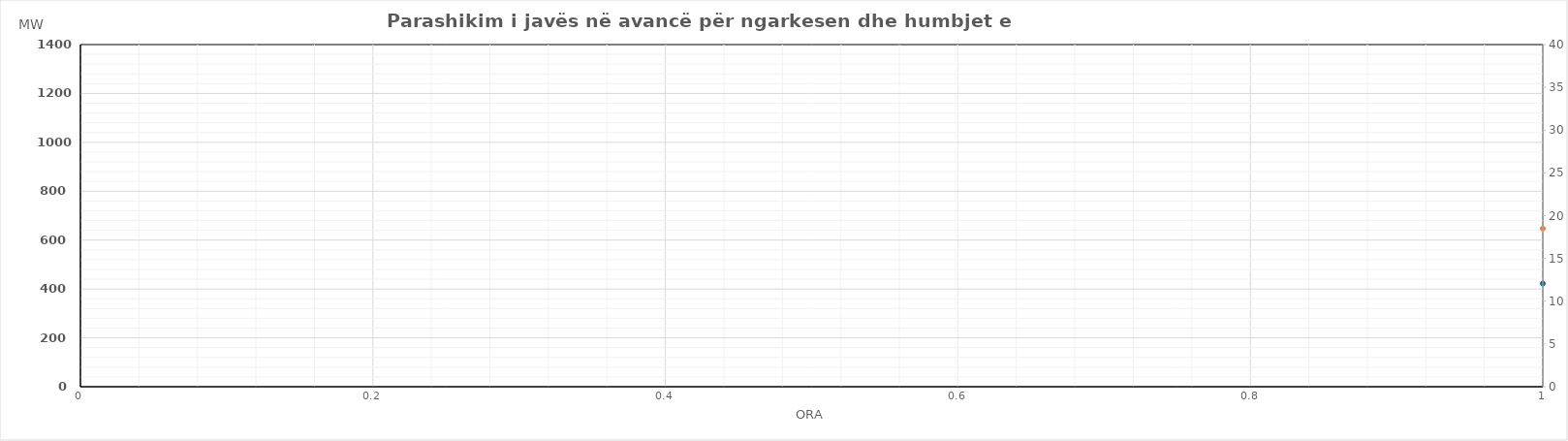
| Category | Ngarkesa (MWh) |
|---|---|
| 0 | 647.48 |
| 1 | 566.39 |
| 2 | 527.26 |
| 3 | 513.78 |
| 4 | 523.76 |
| 5 | 588.65 |
| 6 | 786.59 |
| 7 | 1014.38 |
| 8 | 1095.26 |
| 9 | 1081.1 |
| 10 | 961.15 |
| 11 | 888.1 |
| 12 | 857.79 |
| 13 | 872.79 |
| 14 | 886.19 |
| 15 | 910.8 |
| 16 | 958.86 |
| 17 | 1078.12 |
| 18 | 1211.53 |
| 19 | 1205.01 |
| 20 | 1167.77 |
| 21 | 1063.17 |
| 22 | 906.56 |
| 23 | 726.46 |
| 24 | 579.28 |
| 25 | 512.79 |
| 26 | 482.96 |
| 27 | 478.98 |
| 28 | 484.36 |
| 29 | 550.05 |
| 30 | 733.99 |
| 31 | 955.48 |
| 32 | 1014.36 |
| 33 | 983.6 |
| 34 | 886.75 |
| 35 | 852.4 |
| 36 | 855.49 |
| 37 | 883.89 |
| 38 | 901.59 |
| 39 | 897.6 |
| 40 | 910.66 |
| 41 | 1013.42 |
| 42 | 1148.33 |
| 43 | 1140.81 |
| 44 | 1102.27 |
| 45 | 1001.07 |
| 46 | 858.16 |
| 47 | 706.06 |
| 48 | 626.35 |
| 49 | 540.51 |
| 50 | 489.23 |
| 51 | 483.77 |
| 52 | 490.8 |
| 53 | 571.63 |
| 54 | 737.09 |
| 55 | 950.98 |
| 56 | 976.37 |
| 57 | 957.52 |
| 58 | 913.95 |
| 59 | 884.27 |
| 60 | 872.48 |
| 61 | 895.93 |
| 62 | 913.83 |
| 63 | 903.84 |
| 64 | 924.94 |
| 65 | 1025.35 |
| 66 | 1106.71 |
| 67 | 1100.67 |
| 68 | 1055.91 |
| 69 | 960.76 |
| 70 | 819.02 |
| 71 | 652.55 |
| 72 | 586.05 |
| 73 | 515.6 |
| 74 | 490.13 |
| 75 | 461.86 |
| 76 | 477.19 |
| 77 | 540.14 |
| 78 | 704.78 |
| 79 | 923.87 |
| 80 | 983.15 |
| 81 | 975.81 |
| 82 | 942.14 |
| 83 | 928.05 |
| 84 | 921.46 |
| 85 | 941.52 |
| 86 | 926.73 |
| 87 | 926.34 |
| 88 | 961.06 |
| 89 | 1048.26 |
| 90 | 1120.92 |
| 91 | 1105.48 |
| 92 | 1066.63 |
| 93 | 974.77 |
| 94 | 836.11 |
| 95 | 680.17 |
| 96 | 570.4 |
| 97 | 505.64 |
| 98 | 484.85 |
| 99 | 480.18 |
| 100 | 479.9 |
| 101 | 544.95 |
| 102 | 719.56 |
| 103 | 917.13 |
| 104 | 955.61 |
| 105 | 933.61 |
| 106 | 896.84 |
| 107 | 869.7 |
| 108 | 861.89 |
| 109 | 881.4 |
| 110 | 845.99 |
| 111 | 809.81 |
| 112 | 844.51 |
| 113 | 942.2 |
| 114 | 1036.75 |
| 115 | 1032.63 |
| 116 | 994.62 |
| 117 | 902.08 |
| 118 | 761.77 |
| 119 | 600.05 |
| 120 | 561.33 |
| 121 | 501.49 |
| 122 | 474.73 |
| 123 | 473.63 |
| 124 | 505.42 |
| 125 | 525.54 |
| 126 | 635.55 |
| 127 | 800.39 |
| 128 | 934.76 |
| 129 | 944.7 |
| 130 | 954.59 |
| 131 | 948.94 |
| 132 | 965.97 |
| 133 | 981.53 |
| 134 | 935 |
| 135 | 902.19 |
| 136 | 971.66 |
| 137 | 1088.68 |
| 138 | 1182.21 |
| 139 | 1138.11 |
| 140 | 1034.44 |
| 141 | 937.06 |
| 142 | 816.22 |
| 143 | 686.94 |
| 144 | 631.32 |
| 145 | 542.35 |
| 146 | 489.3 |
| 147 | 468.52 |
| 148 | 470.26 |
| 149 | 507.16 |
| 150 | 601.54 |
| 151 | 773.62 |
| 152 | 901.86 |
| 153 | 922.57 |
| 154 | 901.37 |
| 155 | 829.99 |
| 156 | 819.95 |
| 157 | 801.05 |
| 158 | 799.14 |
| 159 | 794.18 |
| 160 | 883.06 |
| 161 | 1020.97 |
| 162 | 1174.9 |
| 163 | 1144.51 |
| 164 | 1155.82 |
| 165 | 995.87 |
| 166 | 841.69 |
| 167 | 669.95 |